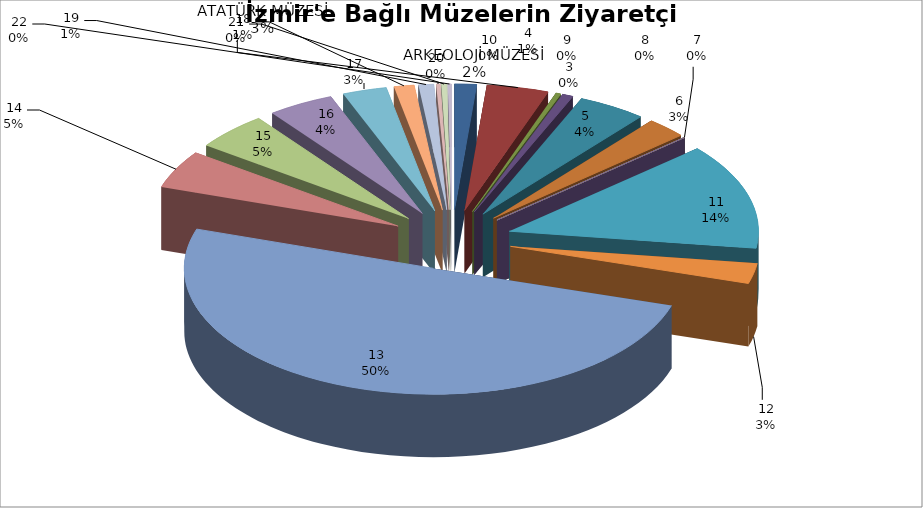
| Category | Series 0 |
|---|---|
| 0 | 54035 |
| 1 | 152276 |
| 2 | 12471 |
| 3 | 26692 |
| 4 | 168209 |
| 5 | 100305 |
| 6 | 1187 |
| 7 | 0 |
| 8 | 0 |
| 9 | 0 |
| 10 | 515175 |
| 11 | 99173 |
| 12 | 1907334 |
| 13 | 184046 |
| 14 | 182269 |
| 15 | 163214 |
| 16 | 108657 |
| 17 | 49544 |
| 18 | 37337 |
| 19 | 9854 |
| 20 | 13170 |
| 21 | 8481 |